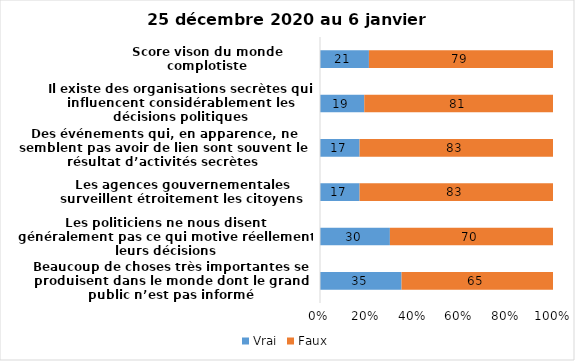
| Category | Vrai | Faux |
|---|---|---|
| Beaucoup de choses très importantes se produisent dans le monde dont le grand public n’est pas informé | 35 | 65 |
| Les politiciens ne nous disent généralement pas ce qui motive réellement leurs décisions | 30 | 70 |
| Les agences gouvernementales surveillent étroitement les citoyens | 17 | 83 |
| Des événements qui, en apparence, ne semblent pas avoir de lien sont souvent le résultat d’activités secrètes | 17 | 83 |
| Il existe des organisations secrètes qui influencent considérablement les décisions politiques | 19 | 81 |
| Score vison du monde complotiste | 21 | 79 |